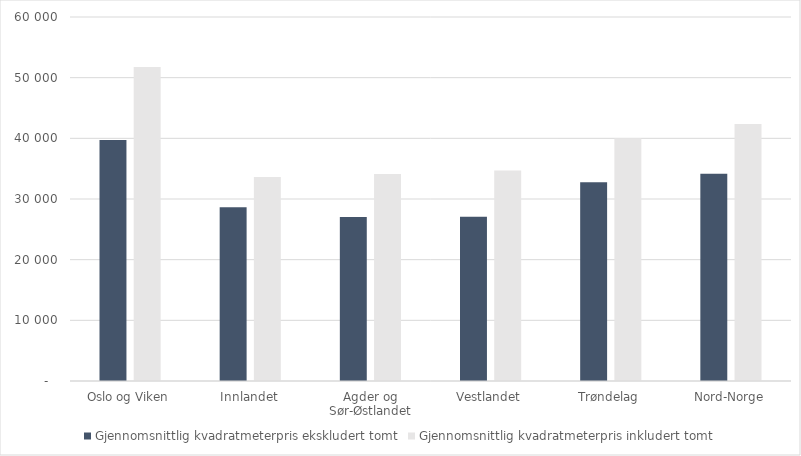
| Category | Gjennomsnittlig kvadratmeterpris ekskludert tomt | Gjennomsnittlig kvadratmeterpris inkludert tomt |
|---|---|---|
| Oslo og Viken | 39722 | 51745 |
| Innlandet | 28659 | 33609 |
| Agder og Sør-Østlandet | 27046 | 34110 |
| Vestlandet | 27078 | 34688 |
| Trøndelag | 32764 | 40005 |
| Nord-Norge | 34148 | 42359 |